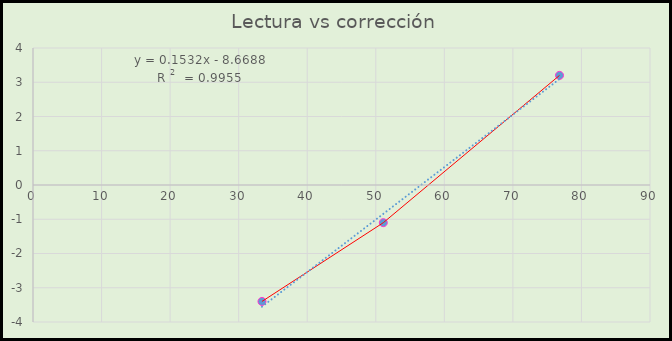
| Category | Corrección %hr |
|---|---|
| 33.4 | -3.4 |
| 51.1 | -1.1 |
| 76.8 | 3.2 |